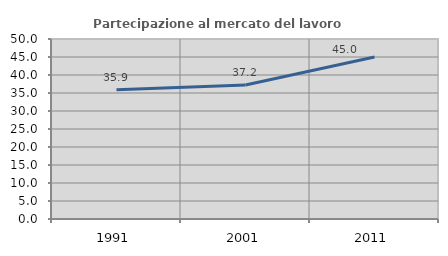
| Category | Partecipazione al mercato del lavoro  femminile |
|---|---|
| 1991.0 | 35.914 |
| 2001.0 | 37.199 |
| 2011.0 | 45.01 |